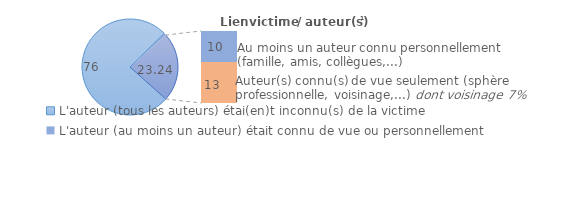
| Category | Series 0 |
|---|---|
| 0 | 76 |
| 1 | 0.76 |
| 2 | 10 |
| 3 | 13.24 |